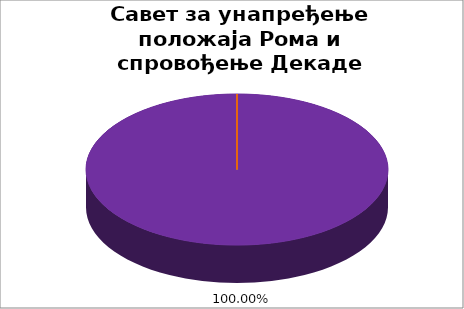
| Category | Савет за унапређење положаја Рома и спровођење Декаде укључивања Рома |
|---|---|
| 0 | 0 |
| 1 | 0 |
| 2 | 0 |
| 3 | 0 |
| 4 | 1 |